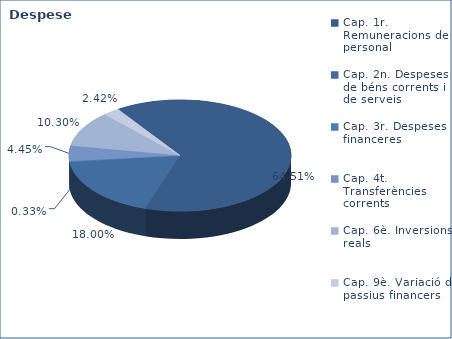
| Category | Series 0 |
|---|---|
| Cap. 1r. Remuneracions de personal | 182361376 |
| Cap. 2n. Despeses de béns corrents i de serveis | 50889268 |
| Cap. 3r. Despeses financeres | 925431 |
| Cap. 4t. Transferències corrents | 12580937 |
| Cap. 6è. Inversions reals | 29120537 |
| Cap. 9è. Variació de passius financers | 6828537 |